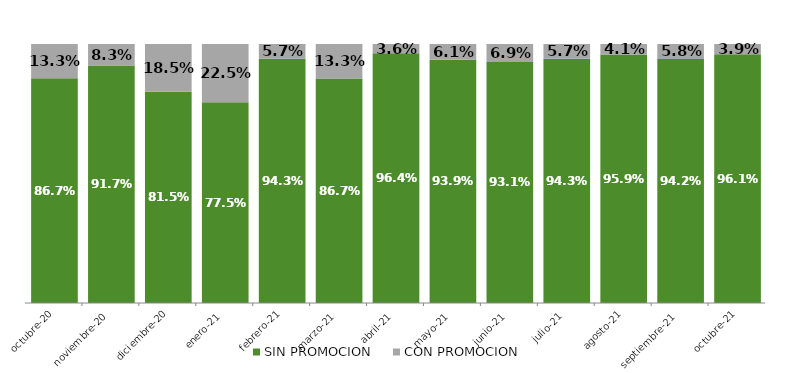
| Category | SIN PROMOCION   | CON PROMOCION   |
|---|---|---|
| 2020-10-01 | 0.867 | 0.133 |
| 2020-11-01 | 0.917 | 0.083 |
| 2020-12-01 | 0.815 | 0.185 |
| 2021-01-01 | 0.775 | 0.225 |
| 2021-02-01 | 0.943 | 0.057 |
| 2021-03-01 | 0.867 | 0.133 |
| 2021-04-01 | 0.964 | 0.036 |
| 2021-05-01 | 0.939 | 0.061 |
| 2021-06-01 | 0.931 | 0.069 |
| 2021-07-01 | 0.943 | 0.057 |
| 2021-08-01 | 0.959 | 0.041 |
| 2021-09-01 | 0.942 | 0.058 |
| 2021-10-01 | 0.961 | 0.039 |